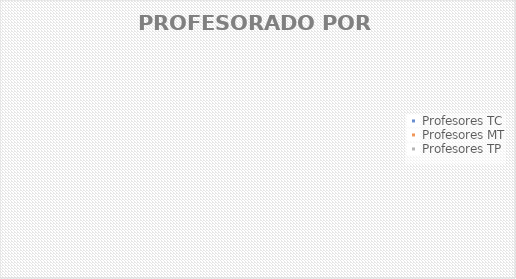
| Category | Series 0 |
|---|---|
| Profesores TC | 0 |
| Profesores MT | 0 |
| Profesores TP | 0 |